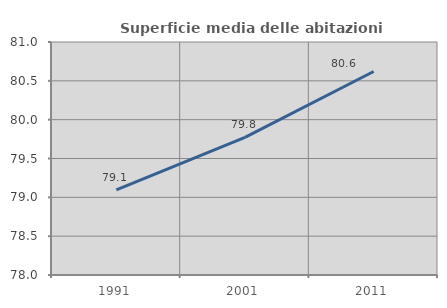
| Category | Superficie media delle abitazioni occupate |
|---|---|
| 1991.0 | 79.095 |
| 2001.0 | 79.773 |
| 2011.0 | 80.62 |